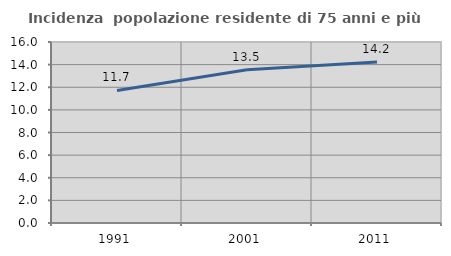
| Category | Incidenza  popolazione residente di 75 anni e più |
|---|---|
| 1991.0 | 11.717 |
| 2001.0 | 13.539 |
| 2011.0 | 14.24 |